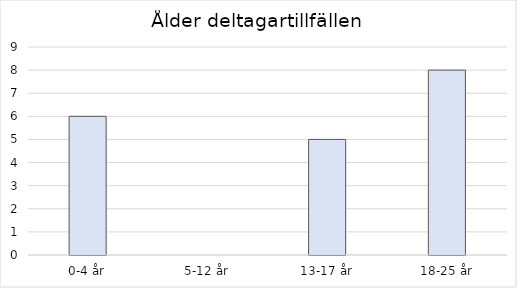
| Category | Series 0 |
|---|---|
| 0-4 år | 6 |
| 5-12 år | 0 |
| 13-17 år | 5 |
| 18-25 år | 8 |